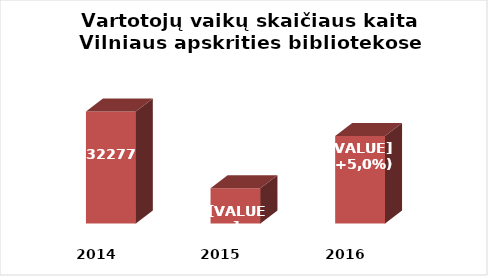
| Category | Series 0 |
|---|---|
| 2014.0 | 32277 |
| 2015.0 | 30032 |
| 2016.0 | 31559 |